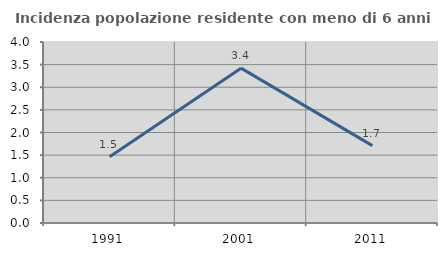
| Category | Incidenza popolazione residente con meno di 6 anni |
|---|---|
| 1991.0 | 1.465 |
| 2001.0 | 3.422 |
| 2011.0 | 1.709 |